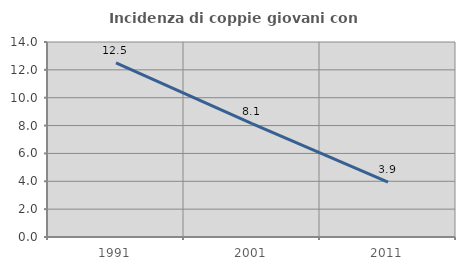
| Category | Incidenza di coppie giovani con figli |
|---|---|
| 1991.0 | 12.5 |
| 2001.0 | 8.14 |
| 2011.0 | 3.947 |